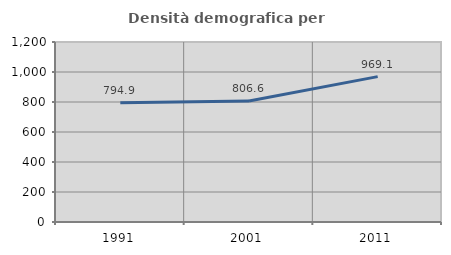
| Category | Densità demografica |
|---|---|
| 1991.0 | 794.907 |
| 2001.0 | 806.566 |
| 2011.0 | 969.077 |